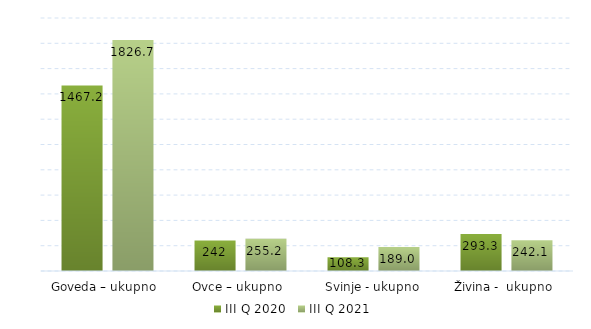
| Category | III Q 2020 | III Q 2021 |
|---|---|---|
| Goveda – ukupno  | 1467.2 | 1826.695 |
| Ovce – ukupno  | 242 | 255.164 |
| Svinje - ukupno | 108.3 | 188.995 |
| Živina -  ukupno  | 293.3 | 242.1 |